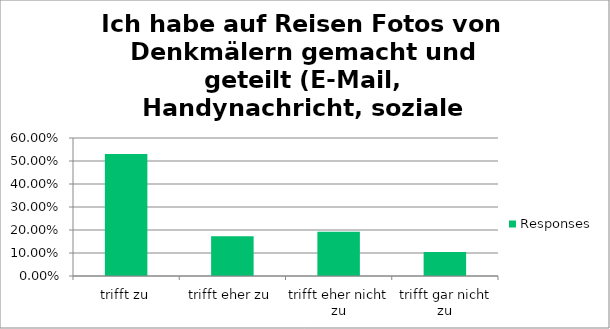
| Category | Responses |
|---|---|
| trifft zu | 0.53 |
| trifft eher zu | 0.173 |
| trifft eher nicht zu | 0.193 |
| trifft gar nicht zu | 0.104 |